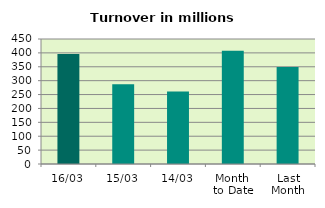
| Category | Series 0 |
|---|---|
| 16/03 | 396.293 |
| 15/03 | 287.196 |
| 14/03 | 261.28 |
| Month 
to Date | 407.66 |
| Last
Month | 349.641 |